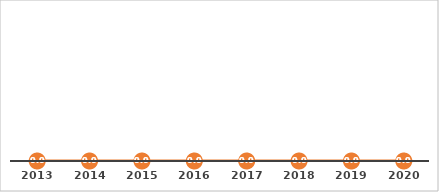
| Category | Cobertura del Padrón de Calidad del Sistema Nacional de Educación Media Superior (PC-SINEMS) |
|---|---|
| 2013.0 | 0 |
| 2014.0 | 0 |
| 2015.0 | 0 |
| 2016.0 | 0 |
| 2017.0 | 0 |
| 2018.0 | 0 |
| 2019.0 | 0 |
| 2020.0 | 0 |